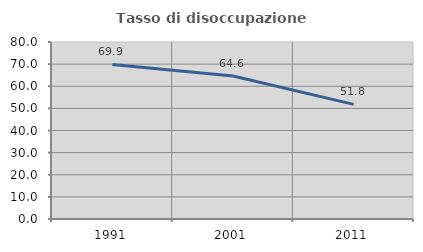
| Category | Tasso di disoccupazione giovanile  |
|---|---|
| 1991.0 | 69.876 |
| 2001.0 | 64.641 |
| 2011.0 | 51.791 |